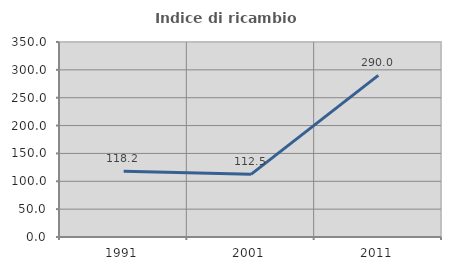
| Category | Indice di ricambio occupazionale  |
|---|---|
| 1991.0 | 118.182 |
| 2001.0 | 112.5 |
| 2011.0 | 290 |